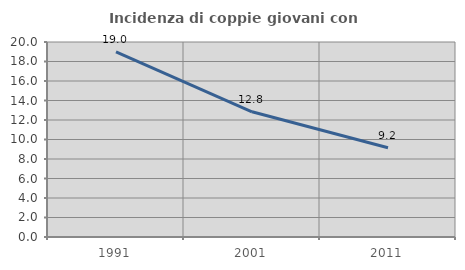
| Category | Incidenza di coppie giovani con figli |
|---|---|
| 1991.0 | 18.99 |
| 2001.0 | 12.842 |
| 2011.0 | 9.154 |